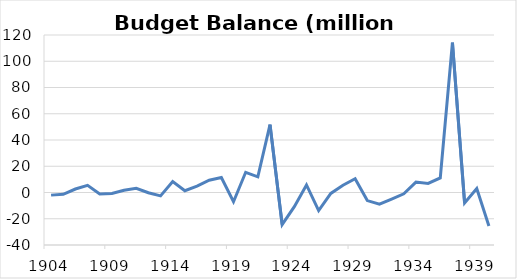
| Category | Budget Balance (millon pesos) |
|---|---|
| 1904.0 | -2.001 |
| 1905.0 | -1.399 |
| 1906.0 | 2.643 |
| 1907.0 | 5.483 |
| 1908.0 | -1.141 |
| 1909.0 | -0.728 |
| 1910.0 | 1.651 |
| 1911.0 | 3.172 |
| 1912.0 | -0.214 |
| 1913.0 | -2.574 |
| 1914.0 | 8.39 |
| 1915.0 | 1.351 |
| 1916.0 | 4.798 |
| 1917.0 | 9.373 |
| 1918.0 | 11.394 |
| 1919.0 | -7.056 |
| 1920.0 | 15.395 |
| 1921.0 | 11.925 |
| 1922.0 | 51.738 |
| 1923.0 | -24.481 |
| 1924.0 | -10.78 |
| 1925.0 | 5.736 |
| 1926.0 | -13.832 |
| 1927.0 | -0.687 |
| 1928.0 | 5.539 |
| 1929.0 | 10.489 |
| 1930.0 | -6.167 |
| 1931.0 | -8.859 |
| 1932.0 | -4.98 |
| 1933.0 | -0.99 |
| 1934.0 | 7.955 |
| 1935.0 | 6.906 |
| 1936.0 | 11.136 |
| 1937.0 | 114.264 |
| 1938.0 | -7.929 |
| 1939.0 | 3.013 |
| 1940.0 | -25.586 |